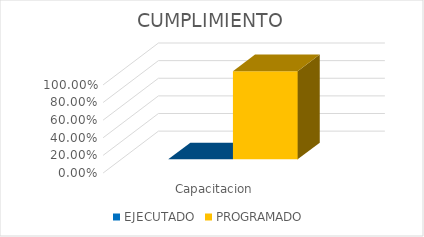
| Category | EJECUTADO | PROGRAMADO |
|---|---|---|
| Capacitacion | 0 | 1 |